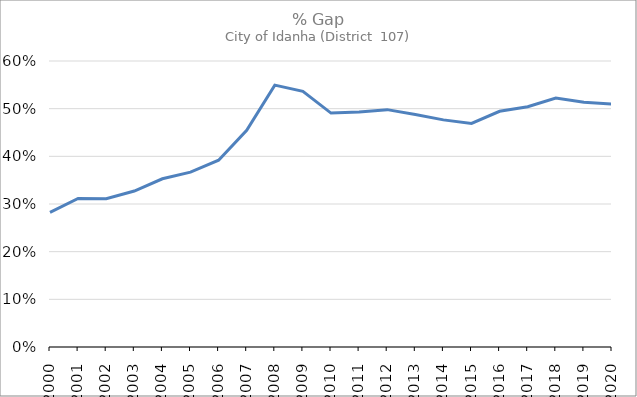
| Category | Series 0 |
|---|---|
| 2000.0 | 0.283 |
| 2001.0 | 0.312 |
| 2002.0 | 0.311 |
| 2003.0 | 0.327 |
| 2004.0 | 0.353 |
| 2005.0 | 0.367 |
| 2006.0 | 0.392 |
| 2007.0 | 0.455 |
| 2008.0 | 0.549 |
| 2009.0 | 0.536 |
| 2010.0 | 0.491 |
| 2011.0 | 0.493 |
| 2012.0 | 0.498 |
| 2013.0 | 0.488 |
| 2014.0 | 0.476 |
| 2015.0 | 0.469 |
| 2016.0 | 0.495 |
| 2017.0 | 0.504 |
| 2018.0 | 0.522 |
| 2019.0 | 0.514 |
| 2020.0 | 0.51 |